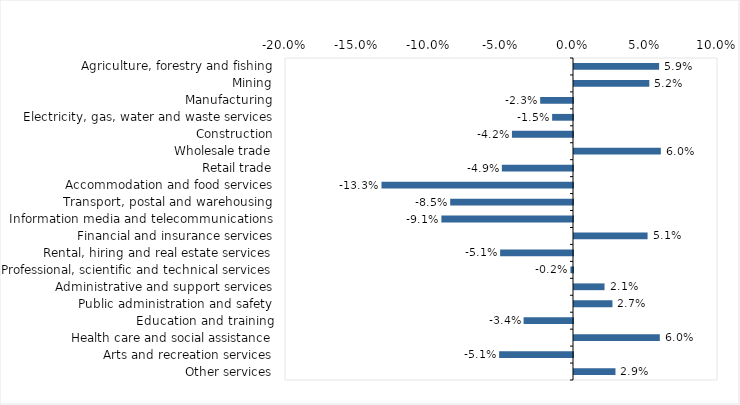
| Category | This week |
|---|---|
| Agriculture, forestry and fishing | 0.059 |
| Mining | 0.052 |
| Manufacturing | -0.023 |
| Electricity, gas, water and waste services | -0.014 |
| Construction | -0.042 |
| Wholesale trade | 0.06 |
| Retail trade | -0.049 |
| Accommodation and food services | -0.133 |
| Transport, postal and warehousing | -0.085 |
| Information media and telecommunications | -0.091 |
| Financial and insurance services | 0.051 |
| Rental, hiring and real estate services | -0.051 |
| Professional, scientific and technical services | -0.002 |
| Administrative and support services | 0.021 |
| Public administration and safety | 0.027 |
| Education and training | -0.034 |
| Health care and social assistance | 0.06 |
| Arts and recreation services | -0.051 |
| Other services | 0.029 |